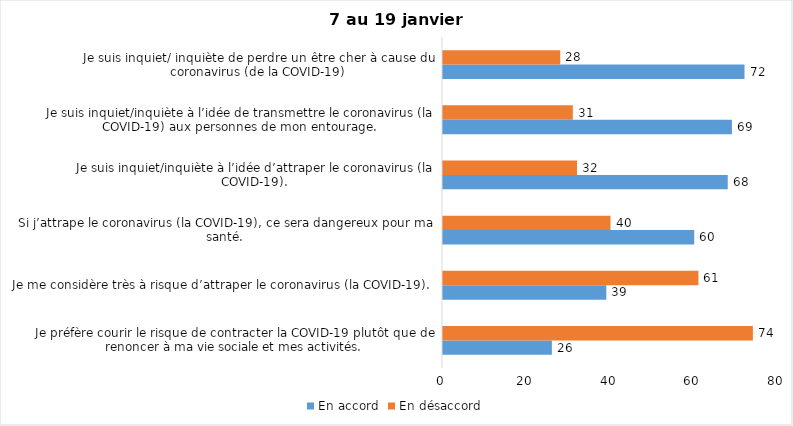
| Category | En accord | En désaccord |
|---|---|---|
| Je préfère courir le risque de contracter la COVID-19 plutôt que de renoncer à ma vie sociale et mes activités. | 26 | 74 |
| Je me considère très à risque d’attraper le coronavirus (la COVID-19). | 39 | 61 |
| Si j’attrape le coronavirus (la COVID-19), ce sera dangereux pour ma santé. | 60 | 40 |
| Je suis inquiet/inquiète à l’idée d’attraper le coronavirus (la COVID-19). | 68 | 32 |
| Je suis inquiet/inquiète à l’idée de transmettre le coronavirus (la COVID-19) aux personnes de mon entourage. | 69 | 31 |
| Je suis inquiet/ inquiète de perdre un être cher à cause du coronavirus (de la COVID-19) | 72 | 28 |